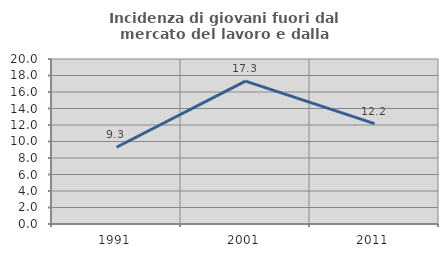
| Category | Incidenza di giovani fuori dal mercato del lavoro e dalla formazione  |
|---|---|
| 1991.0 | 9.308 |
| 2001.0 | 17.317 |
| 2011.0 | 12.168 |